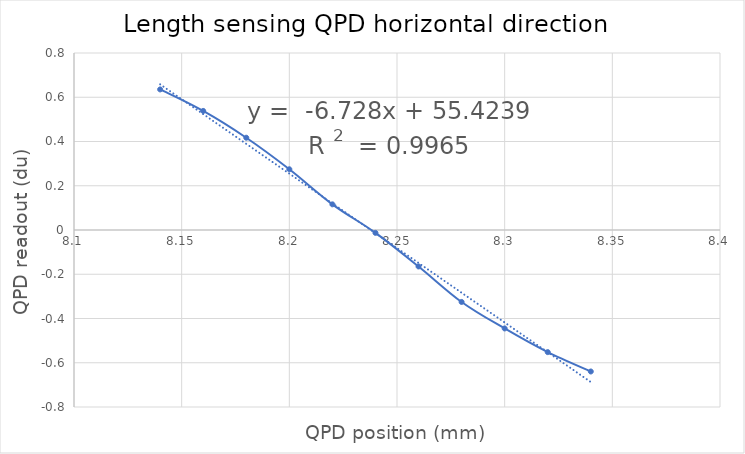
| Category | Series 0 |
|---|---|
| 8.14 | 0.635 |
| 8.16 | 0.538 |
| 8.18 | 0.417 |
| 8.2 | 0.274 |
| 8.22 | 0.116 |
| 8.24 | -0.013 |
| 8.26 | -0.165 |
| 8.28 | -0.325 |
| 8.3 | -0.445 |
| 8.31999999999999 | -0.552 |
| 8.33999999999999 | -0.64 |